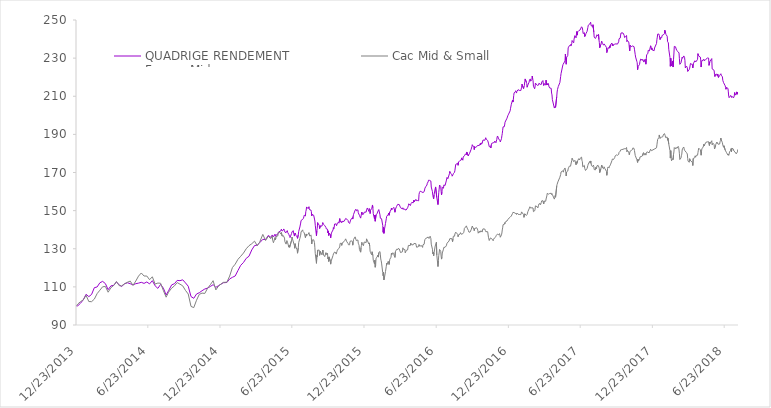
| Category |  QUADRIGE RENDEMENT
France Midcaps  |  Cac Mid & Small  |
|---|---|---|
| 12/23/13 | 100 | 100 |
| 12/27/13 | 100.07 | 101 |
| 1/3/14 | 101.43 | 102.29 |
| 1/10/14 | 103.23 | 103.2 |
| 1/17/14 | 106.11 | 105.56 |
| 1/24/14 | 104.87 | 102.31 |
| 1/31/14 | 106.03 | 102.24 |
| 2/7/14 | 109.58 | 103.59 |
| 2/14/14 | 109.95 | 106.44 |
| 2/21/14 | 112.14 | 108.25 |
| 2/28/14 | 112.89 | 110.06 |
| 3/7/14 | 111.71 | 110.19 |
| 3/14/14 | 108.54 | 107.2 |
| 3/21/14 | 110.53 | 109.56 |
| 3/28/14 | 110.78 | 110.73 |
| 4/4/14 | 112.52 | 112.83 |
| 4/11/14 | 111.1 | 110.64 |
| 4/17/14 | 110.2 | 110.52 |
| 4/25/14 | 111.65 | 111.69 |
| 5/2/14 | 112.16 | 112.44 |
| 5/9/14 | 111.67 | 113.03 |
| 5/16/14 | 111.06 | 110.77 |
| 5/23/14 | 111.68 | 113.06 |
| 5/30/14 | 111.96 | 115.64 |
| 6/6/14 | 112.39 | 117.28 |
| 6/13/14 | 111.83 | 115.69 |
| 6/20/14 | 112.58 | 115.69 |
| 6/27/14 | 111.57 | 113.76 |
| 7/4/14 | 113.24 | 115.3 |
| 7/11/14 | 110.55 | 111.46 |
| 7/18/14 | 109.22 | 112 |
| 7/25/14 | 111.31 | 111.9 |
| 8/1/14 | 109.31 | 108.06 |
| 8/8/14 | 105.75 | 104.59 |
| 8/14/14 | 107.94 | 107.19 |
| 8/22/14 | 111.04 | 109.33 |
| 8/29/14 | 111.66 | 110.52 |
| 9/5/14 | 113.4 | 112.27 |
| 9/12/14 | 113.26 | 111.42 |
| 9/19/14 | 113.7 | 110.55 |
| 9/26/14 | 112.09 | 108.14 |
| 10/3/14 | 110.34 | 106.26 |
| 10/10/14 | 104.92 | 99.76 |
| 10/17/14 | 104 | 99.11 |
| 10/24/14 | 106.25 | 102.99 |
| 10/31/14 | 106.94 | 106.08 |
| 11/7/14 | 107.98 | 106.73 |
| 11/14/14 | 108.88 | 106.56 |
| 11/21/14 | 109.35 | 109.26 |
| 11/28/14 | 110.19 | 111.13 |
| 12/5/14 | 111.16 | 113.25 |
| 12/12/14 | 109.74 | 108.4 |
| 12/19/14 | 110.67 | 110.54 |
| 12/31/14 | 112.17 | 112.36 |
| 1/2/15 | 112.38 | 112.88 |
| 1/9/15 | 112.31 | 112.47 |
| 1/16/15 | 114.17 | 115.68 |
| 1/23/15 | 115.01 | 120.15 |
| 1/30/15 | 115.71 | 121.91 |
| 2/6/15 | 118.57 | 124.44 |
| 2/13/15 | 121.31 | 126.05 |
| 2/20/15 | 122.8 | 127.74 |
| 2/27/15 | 124.98 | 130 |
| 3/6/15 | 126.07 | 131.6 |
| 3/13/15 | 129.37 | 132.62 |
| 3/20/15 | 131.64 | 133.99 |
| 3/27/15 | 131.94 | 131.58 |
| 4/2/15 | 133.13 | 133.44 |
| 4/10/15 | 134.93 | 137.53 |
| 4/17/15 | 134.82 | 134.33 |
| 4/24/15 | 136.99 | 136.57 |
| 4/30/15 | 136.01 | 135.29 |
| 5/4/15 | 137.24 | 136.69 |
| 5/5/15 | 137.02 | 134.45 |
| 5/6/15 | 136.78 | 133.78 |
| 5/7/15 | 136.25 | 133.17 |
| 5/11/15 | 137.65 | 135.86 |
| 5/12/15 | 136.5 | 134.63 |
| 5/13/15 | 136.67 | 135.69 |
| 5/15/15 | 137.45 | 136.71 |
| 5/18/15 | 137.59 | 136.67 |
| 5/19/15 | 138.15 | 138.56 |
| 5/20/15 | 138.77 | 138.47 |
| 5/21/15 | 138.89 | 138.89 |
| 5/22/15 | 139.12 | 138.68 |
| 5/26/15 | 139.42 | 137.69 |
| 5/27/15 | 140.28 | 138.55 |
| 5/28/15 | 140.05 | 138.34 |
| 5/29/15 | 139.32 | 136.64 |
| 6/1/15 | 139.71 | 136.89 |
| 6/2/15 | 140.39 | 136.73 |
| 6/3/15 | 140.31 | 136.66 |
| 6/4/15 | 139.67 | 135.6 |
| 6/5/15 | 138.75 | 133.72 |
| 6/8/15 | 138.43 | 132.43 |
| 6/9/15 | 138.05 | 132.53 |
| 6/10/15 | 138.75 | 134.3 |
| 6/11/15 | 139.51 | 134.56 |
| 6/12/15 | 138.59 | 133.12 |
| 6/15/15 | 137.47 | 130.84 |
| 6/16/15 | 137.17 | 131.7 |
| 6/17/15 | 136.45 | 130.77 |
| 6/18/15 | 135.86 | 130.43 |
| 6/19/15 | 136.25 | 130.95 |
| 6/22/15 | 138.04 | 134.47 |
| 6/23/15 | 138.82 | 136.13 |
| 6/24/15 | 139.14 | 135.29 |
| 6/25/15 | 139.32 | 135.59 |
| 6/26/15 | 139.51 | 135.67 |
| 6/29/15 | 136.65 | 131.74 |
| 6/30/15 | 136.55 | 130.25 |
| 7/1/15 | 138.25 | 132.65 |
| 7/2/15 | 137.69 | 131.5 |
| 7/3/15 | 137.04 | 130.83 |
| 7/6/15 | 136.19 | 129.44 |
| 7/7/15 | 135.46 | 127.66 |
| 7/8/15 | 135.97 | 127.94 |
| 7/9/15 | 137.41 | 130.51 |
| 7/10/15 | 139.11 | 133.3 |
| 7/13/15 | 141.42 | 135.44 |
| 7/15/15 | 143.47 | 137.14 |
| 7/16/15 | 144.83 | 138.82 |
| 7/17/15 | 144.84 | 139.34 |
| 7/20/15 | 145.39 | 139.91 |
| 7/21/15 | 145.49 | 139.01 |
| 7/22/15 | 145.99 | 138.71 |
| 7/23/15 | 146.68 | 138.53 |
| 7/24/15 | 147.6 | 138.34 |
| 7/27/15 | 147.19 | 135.82 |
| 7/28/15 | 149.49 | 136.77 |
| 7/29/15 | 150.29 | 137.76 |
| 7/30/15 | 151.94 | 136.78 |
| 7/31/15 | 151.71 | 137.04 |
| 8/3/15 | 151 | 137.68 |
| 8/4/15 | 150.54 | 137.79 |
| 8/5/15 | 152.07 | 138.5 |
| 8/6/15 | 151.05 | 138.24 |
| 8/7/15 | 150.39 | 136.63 |
| 8/10/15 | 150.29 | 137.27 |
| 8/11/15 | 149.56 | 135.78 |
| 8/12/15 | 147.26 | 132.5 |
| 8/13/15 | 148.02 | 134.54 |
| 8/14/15 | 147.97 | 134.65 |
| 8/17/15 | 147.55 | 134.7 |
| 8/18/15 | 147.15 | 134.83 |
| 8/19/15 | 145.59 | 133.18 |
| 8/20/15 | 144.55 | 130.52 |
| 8/21/15 | 142.33 | 127.5 |
| 8/24/15 | 136.8 | 122.35 |
| 8/25/15 | 139.46 | 126.48 |
| 8/26/15 | 140.68 | 125.86 |
| 8/27/15 | 143.7 | 129.28 |
| 8/28/15 | 143.16 | 129.65 |
| 8/31/15 | 142.39 | 129.26 |
| 9/1/15 | 140.59 | 126.54 |
| 9/2/15 | 140.37 | 126.48 |
| 9/3/15 | 142.02 | 128.61 |
| 9/7/15 | 141.87 | 126.78 |
| 9/8/15 | 142.69 | 127.75 |
| 9/9/15 | 143.76 | 129.34 |
| 9/10/15 | 143.5 | 128.39 |
| 9/11/15 | 142.73 | 126.76 |
| 9/14/15 | 142.19 | 125.87 |
| 9/15/15 | 142.48 | 126.39 |
| 9/16/15 | 142.22 | 127.24 |
| 9/17/15 | 141.15 | 127.91 |
| 9/18/15 | 140.41 | 127 |
| 9/21/15 | 140.25 | 127.69 |
| 9/22/15 | 138.28 | 124.72 |
| 9/23/15 | 139.36 | 125.48 |
| 9/24/15 | 136.99 | 123.34 |
| 9/25/15 | 138.21 | 125.75 |
| 9/28/15 | 137.37 | 123.57 |
| 9/29/15 | 135.7 | 121.92 |
| 9/30/15 | 137.6 | 123.38 |
| 10/1/15 | 137.84 | 123.21 |
| 10/2/15 | 138.75 | 123.68 |
| 10/5/15 | 139.84 | 126.47 |
| 10/6/15 | 141.08 | 127.29 |
| 10/7/15 | 140.52 | 126.89 |
| 10/8/15 | 141.36 | 127.64 |
| 10/9/15 | 142.98 | 128.28 |
| 10/12/15 | 143.08 | 127.94 |
| 10/13/15 | 142.74 | 127.19 |
| 10/14/15 | 142.1 | 126.78 |
| 10/15/15 | 142.48 | 128.57 |
| 10/16/15 | 143.5 | 129.29 |
| 10/19/15 | 143.95 | 130.03 |
| 10/20/15 | 143.41 | 129.73 |
| 10/21/15 | 144.59 | 129.87 |
| 10/22/15 | 145.82 | 130.91 |
| 10/23/15 | 144.12 | 132.82 |
| 10/26/15 | 144.29 | 132.89 |
| 10/27/15 | 143.63 | 131.77 |
| 10/28/15 | 144.36 | 132.97 |
| 10/29/15 | 144.45 | 132.68 |
| 10/30/15 | 144.18 | 132.93 |
| 11/2/15 | 144.36 | 133.77 |
| 11/3/15 | 144.61 | 134.05 |
| 11/4/15 | 145.09 | 134.39 |
| 11/5/15 | 144.93 | 134.24 |
| 11/6/15 | 145.87 | 135.2 |
| 11/9/15 | 145.52 | 133.63 |
| 11/10/15 | 145 | 133.27 |
| 11/12/15 | 144.87 | 132.82 |
| 11/13/15 | 143.9 | 132.1 |
| 11/16/15 | 143.26 | 132.08 |
| 11/17/15 | 144.01 | 133.84 |
| 11/18/15 | 144.62 | 133.73 |
| 11/19/15 | 144.95 | 134.24 |
| 11/20/15 | 145.66 | 134.13 |
| 11/23/15 | 146.23 | 133.85 |
| 11/24/15 | 145.58 | 131.87 |
| 11/25/15 | 147.03 | 133.4 |
| 11/26/15 | 147.98 | 134.85 |
| 11/27/15 | 148.35 | 135.2 |
| 11/30/15 | 150.2 | 136.24 |
| 12/1/15 | 150.66 | 136.31 |
| 12/2/15 | 150.75 | 136.47 |
| 12/3/15 | 149.9 | 134.26 |
| 12/4/15 | 149.74 | 133.93 |
| 12/7/15 | 150.42 | 134.6 |
| 12/8/15 | 148.89 | 132.91 |
| 12/9/15 | 149.37 | 132.38 |
| 12/10/15 | 148.87 | 131.74 |
| 12/11/15 | 147.47 | 129.56 |
| 12/14/15 | 146.06 | 128.2 |
| 12/15/15 | 147.16 | 130.62 |
| 12/16/15 | 148.21 | 131.75 |
| 12/17/15 | 149.26 | 133.33 |
| 12/18/15 | 148.08 | 132.74 |
| 12/21/15 | 148.07 | 131.59 |
| 12/22/15 | 147.75 | 131.47 |
| 12/23/15 | 149.17 | 133.54 |
| 12/24/15 | 149.25 | 133.55 |
| 12/28/15 | 149.24 | 133.27 |
| 12/29/15 | 150.44 | 135.22 |
| 12/30/15 | 150.91 | 135.54 |
| 12/31/15 | 151.39 | 134.94 |
| 1/4/16 | 149.55 | 132.46 |
| 1/5/16 | 151.05 | 133.07 |
| 1/6/16 | 150.51 | 131.33 |
| 1/7/16 | 148.47 | 128.73 |
| 1/8/16 | 150.07 | 128 |
| 1/11/16 | 151.19 | 126.84 |
| 1/12/16 | 151.87 | 128.43 |
| 1/13/16 | 152.96 | 128.66 |
| 1/14/16 | 151.53 | 126.43 |
| 1/15/16 | 148.41 | 124 |
| 1/18/16 | 145.79 | 122.11 |
| 1/19/16 | 147.65 | 123.99 |
| 1/20/16 | 144.44 | 120.31 |
| 1/21/16 | 144.62 | 121.3 |
| 1/22/16 | 147.77 | 125.04 |
| 1/25/16 | 148.58 | 125.65 |
| 1/26/16 | 149.26 | 126.61 |
| 1/27/16 | 148.85 | 127.08 |
| 1/28/16 | 149.29 | 125.61 |
| 1/29/16 | 150.55 | 127.99 |
| 2/1/16 | 147.77 | 128.51 |
| 2/2/16 | 146 | 126.78 |
| 2/3/16 | 145.61 | 124.63 |
| 2/4/16 | 145.75 | 123.7 |
| 2/5/16 | 145.77 | 122.49 |
| 2/8/16 | 142.24 | 117.47 |
| 2/9/16 | 138.64 | 115.85 |
| 2/10/16 | 141.22 | 117.63 |
| 2/11/16 | 138.08 | 113.7 |
| 2/12/16 | 139.76 | 114.5 |
| 2/15/16 | 143.25 | 117.99 |
| 2/16/16 | 143.36 | 118.12 |
| 2/17/16 | 145.73 | 120.81 |
| 2/18/16 | 146.98 | 122.39 |
| 2/19/16 | 146.56 | 121.83 |
| 2/22/16 | 148.02 | 123.45 |
| 2/23/16 | 148.7 | 123.19 |
| 2/24/16 | 147.55 | 121.75 |
| 2/25/16 | 147.7 | 123.08 |
| 2/26/16 | 149.32 | 124.51 |
| 2/29/16 | 150.41 | 125.57 |
| 3/1/16 | 151.32 | 127.68 |
| 3/2/16 | 150.46 | 126.91 |
| 3/3/16 | 150.75 | 126.77 |
| 3/4/16 | 150.79 | 127.84 |
| 3/7/16 | 151.72 | 127.55 |
| 3/8/16 | 151.18 | 126.36 |
| 3/9/16 | 151.05 | 126.74 |
| 3/10/16 | 149.16 | 125.47 |
| 3/11/16 | 150.66 | 128.4 |
| 3/14/16 | 152.16 | 129.73 |
| 3/15/16 | 151.96 | 129.6 |
| 3/16/16 | 152.38 | 129.61 |
| 3/17/16 | 153.3 | 129.56 |
| 3/18/16 | 153.75 | 130.16 |
| 3/21/16 | 153.16 | 129.9 |
| 3/22/16 | 153.17 | 129.85 |
| 3/23/16 | 152.84 | 129.92 |
| 3/24/16 | 151.55 | 128.01 |
| 3/29/16 | 150.88 | 128.42 |
| 3/30/16 | 151.49 | 130.5 |
| 3/31/16 | 150.97 | 130.13 |
| 4/1/16 | 150.64 | 129.59 |
| 4/4/16 | 150.73 | 129.62 |
| 4/5/16 | 150.27 | 127.84 |
| 4/6/16 | 150.61 | 128.21 |
| 4/7/16 | 150.23 | 127.72 |
| 4/8/16 | 150.52 | 129.21 |
| 4/11/16 | 151.48 | 129.35 |
| 4/12/16 | 151.14 | 129.74 |
| 4/13/16 | 152.62 | 131.73 |
| 4/14/16 | 153.59 | 132.03 |
| 4/15/16 | 153.44 | 131.3 |
| 4/18/16 | 152.65 | 131.72 |
| 4/19/16 | 152.78 | 132.99 |
| 4/20/16 | 153.82 | 132.88 |
| 4/21/16 | 153.8 | 132.08 |
| 4/22/16 | 154.4 | 132.15 |
| 4/25/16 | 154.01 | 132.03 |
| 4/26/16 | 154.47 | 132.05 |
| 4/27/16 | 155.52 | 132.76 |
| 4/28/16 | 154.6 | 133.08 |
| 4/29/16 | 154.79 | 132.39 |
| 5/2/16 | 155.91 | 132.66 |
| 5/3/16 | 155.25 | 131.49 |
| 5/4/16 | 155.23 | 130.77 |
| 5/6/16 | 155.29 | 130.75 |
| 5/9/16 | 155.16 | 131.17 |
| 5/10/16 | 158.51 | 132.16 |
| 5/11/16 | 159.49 | 131.42 |
| 5/12/16 | 159.17 | 131.06 |
| 5/13/16 | 160.22 | 131.23 |
| 5/17/16 | 159.81 | 131.58 |
| 5/18/16 | 159.49 | 131.79 |
| 5/19/16 | 159.31 | 130.7 |
| 5/20/16 | 159.47 | 132.07 |
| 5/23/16 | 159.96 | 132.39 |
| 5/24/16 | 160.84 | 134 |
| 5/25/16 | 161.79 | 134.81 |
| 5/26/16 | 161.98 | 135.33 |
| 5/27/16 | 162.55 | 135.47 |
| 5/30/16 | 163.42 | 135.71 |
| 5/31/16 | 164.37 | 135.9 |
| 6/1/16 | 164.73 | 135.67 |
| 6/2/16 | 165.04 | 136.19 |
| 6/3/16 | 165.95 | 135.55 |
| 6/6/16 | 165.86 | 135.6 |
| 6/7/16 | 165.81 | 136.59 |
| 6/8/16 | 165.66 | 136.04 |
| 6/9/16 | 165.49 | 135.36 |
| 6/10/16 | 162.37 | 132.42 |
| 6/13/16 | 159.96 | 129.77 |
| 6/14/16 | 157.94 | 127.34 |
| 6/15/16 | 158.33 | 128.18 |
| 6/16/16 | 156.2 | 126.27 |
| 6/17/16 | 158.21 | 127.81 |
| 6/20/16 | 161.54 | 131.43 |
| 6/21/16 | 162.42 | 131.65 |
| 6/22/16 | 162.08 | 131.8 |
| 6/23/16 | 162.7 | 133.41 |
| 6/24/16 | 156.84 | 126.69 |
| 6/27/16 | 153.18 | 120.68 |
| 6/28/16 | 156.48 | 123.77 |
| 6/29/16 | 159.45 | 126.52 |
| 6/30/16 | 161.27 | 127.78 |
| 7/1/16 | 163.41 | 129.64 |
| 7/4/16 | 162.69 | 128.63 |
| 7/5/16 | 160.02 | 126.17 |
| 7/6/16 | 158.25 | 124.57 |
| 7/7/16 | 159.61 | 125.51 |
| 7/8/16 | 162.28 | 127.78 |
| 7/11/16 | 161.76 | 129.79 |
| 7/12/16 | 163.47 | 130.76 |
| 7/13/16 | 163.63 | 130.73 |
| 7/15/16 | 163.17 | 130.75 |
| 7/18/16 | 165.57 | 131.51 |
| 7/19/16 | 165.58 | 131.34 |
| 7/20/16 | 167.43 | 132.91 |
| 7/21/16 | 167.47 | 132.75 |
| 7/22/16 | 166.72 | 132.94 |
| 7/25/16 | 168.67 | 134.05 |
| 7/26/16 | 169.36 | 134.15 |
| 7/27/16 | 170.53 | 135.29 |
| 7/28/16 | 169.8 | 135.08 |
| 7/29/16 | 169.61 | 135.54 |
| 8/1/16 | 169.05 | 135.34 |
| 8/2/16 | 168.06 | 134.5 |
| 8/3/16 | 167.61 | 133.71 |
| 8/4/16 | 168.79 | 135.16 |
| 8/5/16 | 169.4 | 136.58 |
| 8/8/16 | 170.13 | 136.59 |
| 8/9/16 | 171.17 | 137.79 |
| 8/10/16 | 171.63 | 137.74 |
| 8/11/16 | 174.26 | 138.71 |
| 8/12/16 | 174.05 | 138.69 |
| 8/16/16 | 174.78 | 137.57 |
| 8/17/16 | 173.78 | 136.33 |
| 8/18/16 | 175.46 | 137.24 |
| 8/19/16 | 175.09 | 136.92 |
| 8/22/16 | 176.34 | 137.71 |
| 8/23/16 | 176.25 | 138.45 |
| 8/24/16 | 176.86 | 138.64 |
| 8/25/16 | 176.55 | 137.6 |
| 8/26/16 | 177.68 | 137.9 |
| 8/29/16 | 176.45 | 137.9 |
| 8/30/16 | 178.13 | 138.39 |
| 8/31/16 | 178.02 | 138.43 |
| 9/1/16 | 178.5 | 139.22 |
| 9/2/16 | 178.78 | 140.71 |
| 9/5/16 | 179.81 | 141.38 |
| 9/6/16 | 179.45 | 141.37 |
| 9/7/16 | 179.25 | 142.01 |
| 9/8/16 | 180.77 | 141.71 |
| 9/9/16 | 180.78 | 140.85 |
| 9/12/16 | 178.67 | 139.65 |
| 9/13/16 | 179.27 | 138.83 |
| 9/14/16 | 179.24 | 138.55 |
| 9/15/16 | 180 | 138.79 |
| 9/16/16 | 180.17 | 138.64 |
| 9/19/16 | 182.12 | 139.9 |
| 9/20/16 | 182.48 | 139.82 |
| 9/21/16 | 183.53 | 139.85 |
| 9/22/16 | 184.59 | 141.93 |
| 9/23/16 | 184.32 | 141.48 |
| 9/26/16 | 183.08 | 140.09 |
| 9/27/16 | 182.01 | 139.5 |
| 9/28/16 | 183.63 | 140.61 |
| 9/29/16 | 183.46 | 140.58 |
| 9/30/16 | 183.08 | 140.34 |
| 10/3/16 | 183.49 | 141.04 |
| 10/4/16 | 183.88 | 141.2 |
| 10/5/16 | 184.15 | 140.32 |
| 10/6/16 | 184.47 | 139.61 |
| 10/7/16 | 183.91 | 138.16 |
| 10/10/16 | 184.21 | 139.18 |
| 10/11/16 | 183.97 | 138.55 |
| 10/12/16 | 185.12 | 138.41 |
| 10/13/16 | 184.41 | 138.03 |
| 10/14/16 | 185.49 | 139.47 |
| 10/17/16 | 185.19 | 138.74 |
| 10/18/16 | 185.38 | 139.84 |
| 10/19/16 | 187.02 | 140.42 |
| 10/20/16 | 187.27 | 140.38 |
| 10/21/16 | 186.88 | 140.34 |
| 10/24/16 | 186.92 | 140.29 |
| 10/25/16 | 187.22 | 139.65 |
| 10/26/16 | 188.24 | 138.98 |
| 10/27/16 | 187.58 | 138.59 |
| 10/28/16 | 187.42 | 138.99 |
| 10/31/16 | 186.79 | 138.93 |
| 11/2/16 | 185.4 | 136.03 |
| 11/3/16 | 184.44 | 135.71 |
| 11/4/16 | 183.54 | 134.32 |
| 11/7/16 | 183.5 | 135.68 |
| 11/8/16 | 182.88 | 135.79 |
| 11/9/16 | 184.36 | 136.08 |
| 11/10/16 | 185.25 | 135.34 |
| 11/14/16 | 185.6 | 134.19 |
| 11/15/16 | 185.41 | 134.93 |
| 11/16/16 | 186.12 | 135.16 |
| 11/17/16 | 185.76 | 135.65 |
| 11/18/16 | 186.48 | 136.08 |
| 11/21/16 | 185.6 | 136.38 |
| 11/22/16 | 186.47 | 137.05 |
| 11/23/16 | 187.2 | 136.62 |
| 11/24/16 | 188.59 | 137.21 |
| 11/25/16 | 189.15 | 137.71 |
| 11/28/16 | 187.63 | 137.29 |
| 11/29/16 | 187.18 | 137.52 |
| 11/30/16 | 187.76 | 137.95 |
| 12/1/16 | 186.69 | 137.13 |
| 12/2/16 | 186.03 | 136.03 |
| 12/5/16 | 187.77 | 137.31 |
| 12/6/16 | 189.25 | 138.26 |
| 12/7/16 | 190.38 | 139.87 |
| 12/8/16 | 192.17 | 140.96 |
| 12/9/16 | 193.93 | 142.63 |
| 12/12/16 | 193.99 | 142.74 |
| 12/13/16 | 194.94 | 143.71 |
| 12/14/16 | 196.39 | 143.14 |
| 12/15/16 | 196.88 | 143.72 |
| 12/16/16 | 196.23 | 144.33 |
| 12/19/16 | 198.5 | 144.54 |
| 12/20/16 | 199.09 | 145.04 |
| 12/21/16 | 199.76 | 145.4 |
| 12/22/16 | 200.25 | 145.32 |
| 12/23/16 | 200.61 | 145.81 |
| 12/27/16 | 202.37 | 146.56 |
| 12/28/16 | 203.71 | 146.57 |
| 12/29/16 | 204.15 | 146.9 |
| 12/30/16 | 205.79 | 147.19 |
| 1/2/17 | 208 | 148.55 |
| 1/3/17 | 206.96 | 149.1 |
| 1/4/17 | 208.19 | 148.67 |
| 1/5/17 | 210.33 | 148.85 |
| 1/6/17 | 211.78 | 148.94 |
| 1/9/17 | 212.33 | 148.68 |
| 1/10/17 | 212.89 | 148.92 |
| 1/11/17 | 213.15 | 148.98 |
| 1/12/17 | 211.67 | 147.98 |
| 1/13/17 | 212.5 | 148.75 |
| 1/16/17 | 213.45 | 148.09 |
| 1/17/17 | 213.25 | 147.77 |
| 1/18/17 | 213.09 | 147.59 |
| 1/19/17 | 213.07 | 147.99 |
| 1/20/17 | 212.63 | 147.57 |
| 1/23/17 | 212.99 | 147.89 |
| 1/24/17 | 213.42 | 148.36 |
| 1/25/17 | 214.72 | 149.34 |
| 1/26/17 | 216.34 | 149.49 |
| 1/27/17 | 215.83 | 149.32 |
| 1/30/17 | 214 | 147.87 |
| 1/31/17 | 214.23 | 146.48 |
| 2/1/17 | 215.55 | 147.6 |
| 2/2/17 | 217.68 | 148.39 |
| 2/3/17 | 219.09 | 148.84 |
| 2/6/17 | 217.4 | 147.45 |
| 2/7/17 | 216.69 | 147.86 |
| 2/8/17 | 214.75 | 148 |
| 2/9/17 | 215.39 | 148.52 |
| 2/10/17 | 215.92 | 149.54 |
| 2/13/17 | 217.41 | 150.92 |
| 2/14/17 | 218.48 | 151.38 |
| 2/15/17 | 218.98 | 152.03 |
| 2/16/17 | 219.1 | 151.88 |
| 2/17/17 | 217.9 | 151.3 |
| 2/20/17 | 218.78 | 151.54 |
| 2/21/17 | 220.59 | 151.94 |
| 2/22/17 | 219.21 | 151.72 |
| 2/23/17 | 218.17 | 151.37 |
| 2/24/17 | 215.27 | 149.45 |
| 2/27/17 | 213.93 | 149.9 |
| 2/28/17 | 214.85 | 150.52 |
| 3/1/17 | 216.92 | 152.49 |
| 3/2/17 | 217.3 | 152.55 |
| 3/3/17 | 216.62 | 152.3 |
| 3/6/17 | 215.67 | 152.02 |
| 3/7/17 | 215.5 | 151.43 |
| 3/8/17 | 215.94 | 151.99 |
| 3/9/17 | 215.88 | 152.83 |
| 3/10/17 | 216.85 | 153.52 |
| 3/13/17 | 216.24 | 153.67 |
| 3/14/17 | 216.09 | 153.11 |
| 3/15/17 | 216.31 | 153.21 |
| 3/16/17 | 216.22 | 154.34 |
| 3/17/17 | 217.46 | 155.13 |
| 3/20/17 | 218.23 | 155.22 |
| 3/21/17 | 216.55 | 154.18 |
| 3/22/17 | 215.66 | 153.49 |
| 3/23/17 | 216.67 | 154.98 |
| 3/24/17 | 216.72 | 155.31 |
| 3/27/17 | 215.81 | 154.91 |
| 3/28/17 | 218.45 | 156.1 |
| 3/29/17 | 216.11 | 156.5 |
| 3/30/17 | 216.84 | 157.71 |
| 3/31/17 | 215.94 | 159.08 |
| 4/3/17 | 216.67 | 158.64 |
| 4/4/17 | 215.32 | 158.73 |
| 4/5/17 | 214.89 | 158.94 |
| 4/6/17 | 214.37 | 158.97 |
| 4/7/17 | 213.93 | 159.32 |
| 4/10/17 | 214.14 | 159.12 |
| 4/11/17 | 211.67 | 158.41 |
| 4/12/17 | 210.71 | 158.94 |
| 4/13/17 | 208.21 | 158.41 |
| 4/18/17 | 203.81 | 156.04 |
| 4/19/17 | 203.55 | 156.81 |
| 4/20/17 | 204.7 | 157.83 |
| 4/21/17 | 204.16 | 157.05 |
| 4/24/17 | 209.8 | 162.85 |
| 4/25/17 | 212.22 | 163.79 |
| 4/26/17 | 213.58 | 164.21 |
| 4/27/17 | 213.56 | 165.07 |
| 4/28/17 | 215.12 | 165.52 |
| 5/2/17 | 217.2 | 167.53 |
| 5/3/17 | 217.21 | 167.08 |
| 5/4/17 | 220.38 | 168.95 |
| 5/5/17 | 221.88 | 170.27 |
| 5/9/17 | 225.86 | 170.88 |
| 5/10/17 | 226.64 | 171.17 |
| 5/11/17 | 226.54 | 170.18 |
| 5/12/17 | 226.35 | 171.32 |
| 5/15/17 | 228.51 | 172.37 |
| 5/16/17 | 232.15 | 172.51 |
| 5/17/17 | 228.95 | 170.29 |
| 5/18/17 | 226.79 | 168.18 |
| 5/19/17 | 230.35 | 170.24 |
| 5/22/17 | 231.41 | 170.76 |
| 5/23/17 | 235.37 | 171.89 |
| 5/24/17 | 235.22 | 172.45 |
| 5/26/17 | 236.52 | 173.33 |
| 5/29/17 | 237.07 | 173.31 |
| 5/30/17 | 236.33 | 173.54 |
| 5/31/17 | 236.48 | 173.73 |
| 6/1/17 | 237.53 | 176.29 |
| 6/2/17 | 239.24 | 177.55 |
| 6/6/17 | 238.03 | 175.69 |
| 6/7/17 | 239.99 | 176.14 |
| 6/8/17 | 239.84 | 175.64 |
| 6/9/17 | 241.8 | 176.4 |
| 6/12/17 | 240.64 | 174.05 |
| 6/13/17 | 242.67 | 175.65 |
| 6/14/17 | 243.97 | 175.79 |
| 6/15/17 | 242.07 | 174.78 |
| 6/16/17 | 243.79 | 176.18 |
| 6/19/17 | 244.42 | 177.27 |
| 6/20/17 | 244.26 | 176.82 |
| 6/21/17 | 244.36 | 176.58 |
| 6/22/17 | 244.7 | 177.33 |
| 6/23/17 | 244.45 | 177.2 |
| 6/26/17 | 246.45 | 178.06 |
| 6/27/17 | 246.12 | 176.34 |
| 6/28/17 | 245.84 | 175.68 |
| 6/29/17 | 244.48 | 172.98 |
| 6/30/17 | 242.88 | 172.92 |
| 7/3/17 | 243.38 | 173.72 |
| 7/4/17 | 241.31 | 172.16 |
| 7/5/17 | 241.38 | 172.48 |
| 7/6/17 | 242.26 | 171.06 |
| 7/7/17 | 242.82 | 171.45 |
| 7/10/17 | 244.07 | 172.16 |
| 7/11/17 | 244.04 | 171.85 |
| 7/12/17 | 246.12 | 173.74 |
| 7/13/17 | 247.28 | 174.47 |
| 7/17/17 | 247.95 | 175.89 |
| 7/18/17 | 247.75 | 174.87 |
| 7/19/17 | 248.83 | 176.05 |
| 7/20/17 | 247.39 | 175.46 |
| 7/21/17 | 246.85 | 173.6 |
| 7/24/17 | 246.27 | 173.12 |
| 7/25/17 | 247.53 | 173.36 |
| 7/26/17 | 247.2 | 173.89 |
| 7/27/17 | 243.71 | 173.11 |
| 7/28/17 | 241.02 | 171.55 |
| 7/31/17 | 240.31 | 171.37 |
| 8/1/17 | 240.29 | 172.68 |
| 8/2/17 | 241.05 | 171.84 |
| 8/3/17 | 241.44 | 172.42 |
| 8/4/17 | 242.26 | 173.51 |
| 8/7/17 | 241.6 | 173.72 |
| 8/8/17 | 242.43 | 174.17 |
| 8/9/17 | 239.7 | 172.82 |
| 8/10/17 | 238.25 | 171.98 |
| 8/11/17 | 235.43 | 169.94 |
| 8/14/17 | 237.2 | 172.05 |
| 8/16/17 | 238.92 | 173.87 |
| 8/17/17 | 239.01 | 173.83 |
| 8/18/17 | 237.61 | 172.47 |
| 8/21/17 | 236.79 | 171.93 |
| 8/22/17 | 237.49 | 173 |
| 8/23/17 | 237.75 | 172.49 |
| 8/24/17 | 237.24 | 172.09 |
| 8/25/17 | 236.66 | 171.59 |
| 8/28/17 | 235.61 | 170.63 |
| 8/29/17 | 232.92 | 168.53 |
| 8/30/17 | 233.51 | 170.24 |
| 8/31/17 | 234.32 | 172.23 |
| 9/1/17 | 235.5 | 172.92 |
| 9/4/17 | 235.14 | 172.47 |
| 9/5/17 | 236.29 | 173.26 |
| 9/6/17 | 235.57 | 173.35 |
| 9/7/17 | 236.9 | 174.01 |
| 9/8/17 | 237.25 | 174.42 |
| 9/11/17 | 237.93 | 176.21 |
| 9/12/17 | 236.54 | 177.07 |
| 9/13/17 | 237.36 | 176.88 |
| 9/14/17 | 236.63 | 177.46 |
| 9/15/17 | 236.26 | 176.82 |
| 9/18/17 | 237.35 | 177.85 |
| 9/19/17 | 237.14 | 178.63 |
| 9/20/17 | 237.1 | 178.46 |
| 9/21/17 | 237.48 | 178.66 |
| 9/22/17 | 237.34 | 179.22 |
| 9/25/17 | 237.36 | 179.02 |
| 9/26/17 | 236.91 | 178.61 |
| 9/27/17 | 237.85 | 178.72 |
| 9/28/17 | 238.56 | 179.47 |
| 9/29/17 | 240.16 | 180.55 |
| 10/2/17 | 240.52 | 181.19 |
| 10/3/17 | 242.1 | 181.86 |
| 10/4/17 | 243.2 | 182.18 |
| 10/5/17 | 243.02 | 182.17 |
| 10/6/17 | 243.02 | 182.04 |
| 10/9/17 | 243.21 | 182.14 |
| 10/10/17 | 242.89 | 182.16 |
| 10/11/17 | 242.69 | 182.1 |
| 10/12/17 | 241.96 | 182.46 |
| 10/13/17 | 240.8 | 182.24 |
| 10/16/17 | 241.33 | 182.44 |
| 10/17/17 | 241.38 | 182.36 |
| 10/18/17 | 241.87 | 183.12 |
| 10/19/17 | 238.7 | 180.91 |
| 10/20/17 | 239.28 | 181.59 |
| 10/23/17 | 238.61 | 180.98 |
| 10/24/17 | 237.97 | 180.27 |
| 10/25/17 | 235.61 | 179.33 |
| 10/26/17 | 233.8 | 180.33 |
| 10/27/17 | 236.79 | 181.14 |
| 10/30/17 | 236.02 | 181.57 |
| 10/31/17 | 236.33 | 181.74 |
| 11/2/17 | 236.38 | 182.03 |
| 11/3/17 | 236.37 | 182.88 |
| 11/6/17 | 236.02 | 182.62 |
| 11/7/17 | 234.69 | 181.55 |
| 11/8/17 | 234.34 | 181.47 |
| 11/9/17 | 231.85 | 178.96 |
| 11/10/17 | 230.55 | 178.44 |
| 11/13/17 | 228.33 | 176.77 |
| 11/14/17 | 227.62 | 176.75 |
| 11/15/17 | 223.94 | 175.26 |
| 11/16/17 | 225.46 | 176.98 |
| 11/17/17 | 225.93 | 176.04 |
| 11/20/17 | 226.72 | 176.85 |
| 11/21/17 | 228.24 | 178.16 |
| 11/22/17 | 228.4 | 178.08 |
| 11/23/17 | 229.53 | 178.48 |
| 11/24/17 | 229.3 | 178.34 |
| 11/27/17 | 228.83 | 178.64 |
| 11/28/17 | 229.38 | 179.71 |
| 11/29/17 | 229.36 | 179.7 |
| 11/30/17 | 229.82 | 180.45 |
| 12/1/17 | 227.91 | 179.06 |
| 12/4/17 | 229.43 | 180.17 |
| 12/5/17 | 228.78 | 179.97 |
| 12/6/17 | 226.82 | 179.12 |
| 12/7/17 | 229.63 | 179.86 |
| 12/8/17 | 231.84 | 180.66 |
| 12/11/17 | 232.36 | 180.76 |
| 12/12/17 | 234.1 | 180.88 |
| 12/13/17 | 233.62 | 180.75 |
| 12/14/17 | 233.6 | 180.26 |
| 12/15/17 | 233.8 | 179.96 |
| 12/18/17 | 236.46 | 182.21 |
| 12/19/17 | 235.58 | 182.05 |
| 12/20/17 | 234.63 | 181.43 |
| 12/21/17 | 235.35 | 181.82 |
| 12/22/17 | 234.27 | 181.7 |
| 12/27/17 | 233.91 | 182.22 |
| 12/28/17 | 235.3 | 182.45 |
| 12/29/17 | 235.83 | 182.21 |
| 1/2/18 | 237.69 | 182.96 |
| 1/3/18 | 239.83 | 184.53 |
| 1/4/18 | 241.04 | 186.08 |
| 1/5/18 | 242.63 | 187.41 |
| 1/8/18 | 242.62 | 188.32 |
| 1/9/18 | 241.94 | 189.69 |
| 1/10/18 | 241.88 | 188.67 |
| 1/11/18 | 239.73 | 187.81 |
| 1/12/18 | 240.72 | 188.36 |
| 1/15/18 | 240.66 | 188.55 |
| 1/16/18 | 241.88 | 188.92 |
| 1/17/18 | 242.23 | 188.97 |
| 1/18/18 | 241.94 | 188.78 |
| 1/19/18 | 242.17 | 189.68 |
| 1/22/18 | 242.79 | 190.41 |
| 1/23/18 | 244.66 | 190.38 |
| 1/24/18 | 244.81 | 189.36 |
| 1/25/18 | 243.07 | 188.35 |
| 1/26/18 | 242.4 | 188.87 |
| 1/29/18 | 241.49 | 188.59 |
| 1/30/18 | 238.58 | 186.95 |
| 1/31/18 | 238.15 | 187.98 |
| 2/1/18 | 238.05 | 187.88 |
| 2/2/18 | 234.67 | 184.99 |
| 2/5/18 | 230.39 | 181.49 |
| 2/6/18 | 225.68 | 177.58 |
| 2/7/18 | 229.97 | 181.47 |
| 2/8/18 | 227.45 | 177.58 |
| 2/9/18 | 225.95 | 176.14 |
| 2/12/18 | 228.46 | 177.3 |
| 2/13/18 | 225.33 | 176.77 |
| 2/14/18 | 229.17 | 179.29 |
| 2/15/18 | 232.16 | 180.78 |
| 2/16/18 | 236.16 | 183.08 |
| 2/19/18 | 235.97 | 182.41 |
| 2/20/18 | 236.43 | 183.12 |
| 2/21/18 | 235.93 | 183.57 |
| 2/22/18 | 234.08 | 182.85 |
| 2/23/18 | 233.63 | 182.71 |
| 2/26/18 | 233.29 | 183.7 |
| 2/27/18 | 233.79 | 183.11 |
| 2/28/18 | 232.67 | 181.82 |
| 3/1/18 | 229.66 | 179.84 |
| 3/2/18 | 226.73 | 176.8 |
| 3/5/18 | 227.54 | 177.63 |
| 3/6/18 | 227.39 | 178.81 |
| 3/7/18 | 227.66 | 179.65 |
| 3/8/18 | 230.53 | 181.79 |
| 3/9/18 | 229.92 | 182.6 |
| 3/12/18 | 231.15 | 183.38 |
| 3/13/18 | 230.95 | 182.31 |
| 3/14/18 | 230.44 | 181.68 |
| 3/15/18 | 228.7 | 182.08 |
| 3/16/18 | 224.82 | 181.42 |
| 3/19/18 | 225.81 | 180.41 |
| 3/20/18 | 226.23 | 180.26 |
| 3/21/18 | 224.99 | 179.72 |
| 3/22/18 | 222.99 | 177.37 |
| 3/23/18 | 222.58 | 175.92 |
| 3/26/18 | 224.08 | 175.37 |
| 3/27/18 | 224.72 | 177.23 |
| 3/28/18 | 224.67 | 176.54 |
| 3/29/18 | 227.2 | 176.52 |
| 4/3/18 | 226.53 | 175.2 |
| 4/4/18 | 224.84 | 173.67 |
| 4/5/18 | 226.97 | 177.37 |
| 4/6/18 | 226.98 | 177.65 |
| 4/9/18 | 228.61 | 177.77 |
| 4/10/18 | 228.92 | 178.72 |
| 4/11/18 | 228.41 | 178.07 |
| 4/12/18 | 228.06 | 178.55 |
| 4/13/18 | 228.47 | 179.01 |
| 4/16/18 | 229.37 | 179.07 |
| 4/17/18 | 232.34 | 180.43 |
| 4/18/18 | 231.32 | 181.71 |
| 4/19/18 | 231.08 | 182.75 |
| 4/20/18 | 231.06 | 182.67 |
| 4/23/18 | 230.58 | 181.92 |
| 4/24/18 | 229.06 | 180.74 |
| 4/25/18 | 225.33 | 179.07 |
| 4/26/18 | 227.63 | 181.07 |
| 4/27/18 | 228.78 | 182.61 |
| 4/30/18 | 228.85 | 183.16 |
| 5/2/18 | 229.44 | 184.84 |
| 5/3/18 | 228.53 | 183.98 |
| 5/4/18 | 228.81 | 184.57 |
| 5/7/18 | 229.37 | 185.82 |
| 5/9/18 | 229.23 | 186.01 |
| 5/11/18 | 230.06 | 186.09 |
| 5/14/18 | 230.03 | 186.15 |
| 5/15/18 | 226.2 | 184.75 |
| 5/16/18 | 225.9 | 184.14 |
| 5/17/18 | 228.11 | 185.84 |
| 5/18/18 | 228.07 | 185.25 |
| 5/22/18 | 229.76 | 186.67 |
| 5/23/18 | 224.34 | 184.48 |
| 5/24/18 | 224.3 | 184.69 |
| 5/25/18 | 224.28 | 185.37 |
| 5/28/18 | 223.59 | 184.59 |
| 5/29/18 | 221.29 | 182.35 |
| 5/30/18 | 220.36 | 182.45 |
| 5/31/18 | 221.41 | 183.14 |
| 6/1/18 | 221.76 | 184.62 |
| 6/4/18 | 221.58 | 186 |
| 6/5/18 | 220.78 | 185.65 |
| 6/6/18 | 221.68 | 185.89 |
| 6/7/18 | 221.35 | 184.83 |
| 6/8/18 | 219.86 | 184.34 |
| 6/11/18 | 220.9 | 184.93 |
| 6/12/18 | 221.12 | 186.11 |
| 6/13/18 | 220.85 | 186.79 |
| 6/14/18 | 221.81 | 188.05 |
| 6/15/18 | 221.05 | 187.15 |
| 6/18/18 | 220.18 | 185.61 |
| 6/19/18 | 218.33 | 184.44 |
| 6/20/18 | 218.19 | 184.05 |
| 6/21/18 | 217.11 | 183.21 |
| 6/22/18 | 217.05 | 184.06 |
| 6/25/18 | 215.49 | 181.76 |
| 6/26/18 | 214.71 | 181.61 |
| 6/27/18 | 213.68 | 182.18 |
| 6/28/18 | 214.58 | 180.58 |
| 6/29/18 | 214.53 | 181.1 |
| 7/2/18 | 214.15 | 179.12 |
| 7/3/18 | 212.29 | 179.69 |
| 7/4/18 | 209.92 | 178.97 |
| 7/5/18 | 209.25 | 179.69 |
| 7/6/18 | 209.11 | 180.74 |
| 7/9/18 | 210.45 | 181.68 |
| 7/10/18 | 210.89 | 182.49 |
| 7/11/18 | 209.37 | 180.92 |
| 7/12/18 | 210.01 | 182.72 |
| 7/13/18 | 209.89 | 182.49 |
| 7/16/18 | 209.12 | 182.26 |
| 7/17/18 | 209.28 | 181.27 |
| 7/18/18 | 210.14 | 181.61 |
| 7/19/18 | 211.94 | 180.96 |
| 7/20/18 | 210.83 | 180.73 |
| 7/23/18 | 210.83 | 179.78 |
| 7/24/18 | 212.29 | 180.13 |
| 7/25/18 | 211.2 | 180.21 |
| 7/26/18 | 212.18 | 180.83 |
| 7/27/18 | 210.96 | 182.1 |